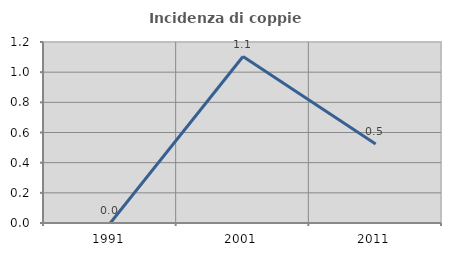
| Category | Incidenza di coppie miste |
|---|---|
| 1991.0 | 0 |
| 2001.0 | 1.104 |
| 2011.0 | 0.524 |